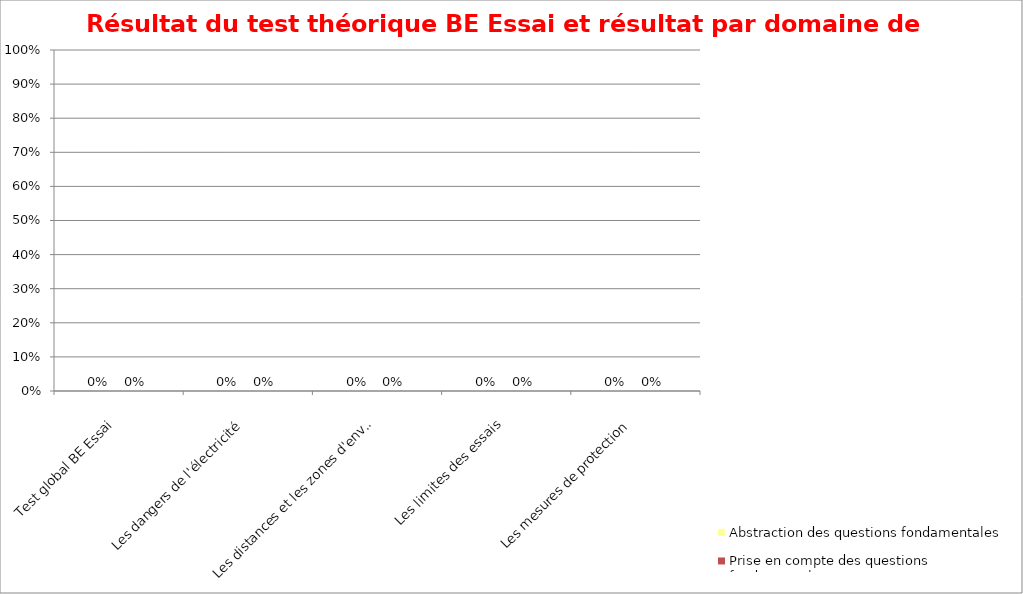
| Category | Abstraction des questions fondamentales | Prise en compte des questions fondamentales |
|---|---|---|
| Test global BE Essai | 0 | 0 |
| Les dangers de l'électricité | 0 | 0 |
| Les distances et les zones d'environnement | 0 | 0 |
| Les limites des essais | 0 | 0 |
| Les mesures de protection | 0 | 0 |